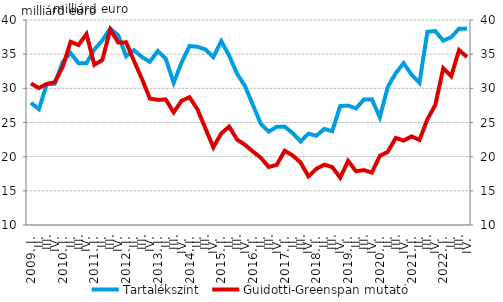
| Category | Tartalékszint |
|---|---|
| 2009. I. | 27.89 |
|          II. | 26.95 |
|          III. | 30.603 |
|          IV. | 30.677 |
| 2010. I. | 33.852 |
|          II. | 35.174 |
|          III. | 33.676 |
|          IV. | 33.674 |
| 2011. I. | 35.692 |
|          II. | 37.003 |
|          III. | 38.764 |
|          IV. | 37.774 |
| 2012. I. | 34.697 |
|          II. | 35.575 |
|          III. | 34.577 |
|          IV. | 33.881 |
| 2013. I. | 35.467 |
| II. | 34.329 |
|          III. | 30.815 |
| IV. | 33.782 |
| 2014. I. | 36.197 |
| II. | 36.08 |
|          III. | 35.684 |
| IV. | 34.578 |
| 2015. I. | 36.908 |
| II. | 34.761 |
|          III. | 32.127 |
| IV. | 30.322 |
| 2016. I. | 27.551 |
| II. | 24.785 |
|          III. | 23.661 |
| IV. | 24.384 |
| 2017. I. | 24.398 |
| II. | 23.461 |
|          III. | 22.226 |
| IV. | 23.368 |
| 2018. I. | 23.059 |
| II. | 24.061 |
|          III. | 23.727 |
| IV. | 27.403 |
| 2019. I. | 27.478 |
| II. | 27.065 |
|          III. | 28.367 |
| IV. | 28.386 |
| 2020. I. | 25.772 |
| II. | 30.193 |
|          III. | 32.212 |
| IV. | 33.677 |
| 2021. I. | 32.006 |
| II. | 30.803 |
|          III. | 38.273 |
| IV. | 38.377 |
| 2022. I. | 36.972 |
| II. | 37.48 |
|          III. | 38.74 |
| IV. | 38.709 |